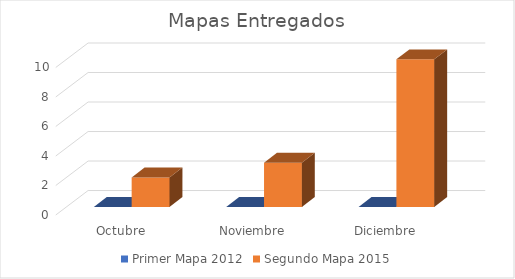
| Category | Primer Mapa 2012 | Segundo Mapa 2015 |
|---|---|---|
| Octubre | 0 | 2 |
| Noviembre | 0 | 3 |
| Diciembre | 0 | 10 |